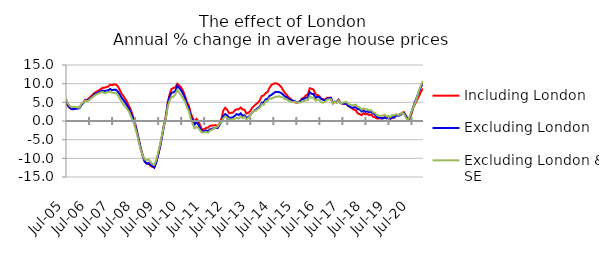
| Category | Including London | Excluding London | Excluding London & SE |
|---|---|---|---|
| 2005-07-01 | 5.042 | 5.34 | 6.041 |
| 2005-08-01 | 4.021 | 4.233 | 4.729 |
| 2005-09-01 | 3.44 | 3.609 | 4.031 |
| 2005-10-01 | 3.117 | 3.198 | 3.683 |
| 2005-11-01 | 3.119 | 3.179 | 3.804 |
| 2005-12-01 | 3.391 | 3.293 | 3.72 |
| 2006-01-01 | 3.46 | 3.314 | 3.632 |
| 2006-02-01 | 3.679 | 3.428 | 3.573 |
| 2006-03-01 | 4.36 | 4.288 | 4.578 |
| 2006-04-01 | 4.971 | 4.807 | 4.982 |
| 2006-05-01 | 5.703 | 5.549 | 5.472 |
| 2006-06-01 | 5.682 | 5.378 | 5.289 |
| 2006-07-01 | 6.13 | 5.818 | 5.553 |
| 2006-08-01 | 6.584 | 6.212 | 6.08 |
| 2006-09-01 | 7.141 | 6.725 | 6.422 |
| 2006-10-01 | 7.569 | 7.227 | 6.924 |
| 2006-11-01 | 7.9 | 7.477 | 7.14 |
| 2006-12-01 | 8.141 | 7.684 | 7.41 |
| 2007-01-01 | 8.527 | 7.906 | 7.62 |
| 2007-02-01 | 8.881 | 8.173 | 7.77 |
| 2007-03-01 | 8.911 | 8.019 | 7.457 |
| 2007-04-01 | 9.095 | 8.169 | 7.568 |
| 2007-05-01 | 9.213 | 8.204 | 7.716 |
| 2007-06-01 | 9.739 | 8.578 | 7.871 |
| 2007-07-01 | 9.603 | 8.264 | 7.598 |
| 2007-08-01 | 9.834 | 8.384 | 7.471 |
| 2007-09-01 | 9.759 | 8.353 | 7.476 |
| 2007-10-01 | 9.31 | 7.908 | 6.946 |
| 2007-11-01 | 8.338 | 7.116 | 6.089 |
| 2007-12-01 | 7.301 | 6.209 | 5.13 |
| 2008-01-01 | 6.594 | 5.569 | 4.358 |
| 2008-02-01 | 5.803 | 4.819 | 3.807 |
| 2008-03-01 | 4.897 | 4.031 | 3.135 |
| 2008-04-01 | 3.869 | 3.081 | 2.34 |
| 2008-05-01 | 2.669 | 1.982 | 1.042 |
| 2008-06-01 | 1.104 | 0.608 | -0.088 |
| 2008-07-01 | -0.68 | -0.992 | -1.674 |
| 2008-08-01 | -2.784 | -3 | -3.489 |
| 2008-09-01 | -5.142 | -5.294 | -5.824 |
| 2008-10-01 | -7.4 | -7.555 | -7.844 |
| 2008-11-01 | -9.283 | -9.376 | -9.246 |
| 2008-12-01 | -10.716 | -10.891 | -10.295 |
| 2009-01-01 | -11.416 | -11.431 | -10.399 |
| 2009-02-01 | -11.461 | -11.235 | -10.34 |
| 2009-03-01 | -11.986 | -11.748 | -10.864 |
| 2009-04-01 | -12.284 | -12.069 | -11.542 |
| 2009-05-01 | -12.391 | -12.497 | -11.751 |
| 2009-06-01 | -11.045 | -11.133 | -10.506 |
| 2009-07-01 | -9.035 | -9.204 | -8.454 |
| 2009-08-01 | -6.756 | -6.883 | -6.256 |
| 2009-09-01 | -3.959 | -4.358 | -3.813 |
| 2009-10-01 | -1.05 | -1.44 | -1.209 |
| 2009-11-01 | 1.332 | 0.762 | 0.706 |
| 2009-12-01 | 4.938 | 4.524 | 3.867 |
| 2010-01-01 | 7.185 | 6.538 | 5.474 |
| 2010-02-01 | 8.595 | 7.568 | 6.419 |
| 2010-03-01 | 8.825 | 7.698 | 6.489 |
| 2010-04-01 | 9.037 | 8.044 | 7.15 |
| 2010-05-01 | 9.954 | 9.479 | 8.277 |
| 2010-06-01 | 9.51 | 8.83 | 7.67 |
| 2010-07-01 | 8.98 | 8.233 | 6.814 |
| 2010-08-01 | 8.1 | 7.247 | 5.995 |
| 2010-09-01 | 6.68 | 6.17 | 5.224 |
| 2010-10-01 | 5.06 | 4.477 | 3.72 |
| 2010-11-01 | 4.111 | 3.455 | 2.686 |
| 2010-12-01 | 2.111 | 1.245 | 0.589 |
| 2011-01-01 | 0.812 | 0.009 | -0.813 |
| 2011-02-01 | -0.153 | -0.975 | -1.959 |
| 2011-03-01 | 0.561 | -0.352 | -1.604 |
| 2011-04-01 | -0.049 | -0.993 | -1.861 |
| 2011-05-01 | -1.337 | -2.104 | -2.603 |
| 2011-06-01 | -2.364 | -2.804 | -3.111 |
| 2011-07-01 | -2.193 | -2.71 | -3.015 |
| 2011-08-01 | -1.838 | -2.514 | -2.939 |
| 2011-09-01 | -1.815 | -2.702 | -3.127 |
| 2011-10-01 | -1.313 | -2.26 | -2.601 |
| 2011-11-01 | -1.193 | -2.051 | -2.33 |
| 2011-12-01 | -1.187 | -1.975 | -2.083 |
| 2012-01-01 | -1.1 | -1.808 | -1.74 |
| 2012-02-01 | -1.426 | -1.872 | -1.49 |
| 2012-03-01 | -0.66 | -1.074 | -0.763 |
| 2012-04-01 | 0.645 | -0.139 | -0.379 |
| 2012-05-01 | 2.851 | 1.385 | 0.785 |
| 2012-06-01 | 3.556 | 1.855 | 1.213 |
| 2012-07-01 | 2.98 | 1.48 | 0.842 |
| 2012-08-01 | 2.051 | 0.876 | 0.424 |
| 2012-09-01 | 2.183 | 0.85 | 0.325 |
| 2012-10-01 | 2.249 | 1.007 | 0.526 |
| 2012-11-01 | 2.896 | 1.405 | 0.672 |
| 2012-12-01 | 3.177 | 1.864 | 0.816 |
| 2013-01-01 | 3.149 | 1.614 | 0.648 |
| 2013-02-01 | 3.602 | 2.058 | 1.223 |
| 2013-03-01 | 3.097 | 1.383 | 0.768 |
| 2013-04-01 | 3.012 | 1.539 | 1.119 |
| 2013-05-01 | 1.998 | 0.817 | 0.37 |
| 2013-06-01 | 2.165 | 1.096 | 0.849 |
| 2013-07-01 | 2.664 | 1.622 | 1.488 |
| 2013-08-01 | 3.537 | 2.231 | 2.192 |
| 2013-09-01 | 4.062 | 2.809 | 2.824 |
| 2013-10-01 | 4.504 | 3.05 | 2.769 |
| 2013-11-01 | 4.904 | 3.489 | 3.256 |
| 2013-12-01 | 5.552 | 3.894 | 3.532 |
| 2014-01-01 | 6.672 | 4.881 | 4.507 |
| 2014-02-01 | 6.837 | 4.965 | 4.315 |
| 2014-03-01 | 7.485 | 5.784 | 5.271 |
| 2014-04-01 | 7.762 | 5.942 | 5.327 |
| 2014-05-01 | 8.89 | 6.699 | 6.153 |
| 2014-06-01 | 9.637 | 6.984 | 5.954 |
| 2014-07-01 | 9.951 | 7.361 | 6.199 |
| 2014-08-01 | 10.096 | 7.756 | 6.47 |
| 2014-09-01 | 10.007 | 7.805 | 6.464 |
| 2014-10-01 | 9.695 | 7.747 | 6.671 |
| 2014-11-01 | 9.213 | 7.531 | 6.418 |
| 2014-12-01 | 8.373 | 7.095 | 6.34 |
| 2015-01-01 | 7.547 | 6.647 | 5.856 |
| 2015-02-01 | 7.027 | 6.342 | 5.823 |
| 2015-03-01 | 6.305 | 5.908 | 5.404 |
| 2015-04-01 | 5.966 | 5.669 | 5.238 |
| 2015-05-01 | 5.412 | 5.482 | 5.073 |
| 2015-06-01 | 5.095 | 5.374 | 5.149 |
| 2015-07-01 | 4.873 | 5.112 | 5.019 |
| 2015-08-01 | 5.068 | 5.03 | 4.93 |
| 2015-09-01 | 5.314 | 5.251 | 4.922 |
| 2015-10-01 | 6.053 | 5.827 | 5.238 |
| 2015-11-01 | 6.264 | 5.939 | 5.358 |
| 2015-12-01 | 6.887 | 6.247 | 5.55 |
| 2016-01-01 | 7.107 | 6.314 | 5.615 |
| 2016-02-01 | 8.779 | 7.698 | 6.563 |
| 2016-03-01 | 8.635 | 7.291 | 6.253 |
| 2016-04-01 | 8.371 | 7.184 | 6.224 |
| 2016-05-01 | 7.156 | 6.181 | 5.489 |
| 2016-06-01 | 6.972 | 6.52 | 5.778 |
| 2016-07-01 | 6.659 | 6.355 | 5.535 |
| 2016-08-01 | 5.976 | 5.937 | 5.005 |
| 2016-09-01 | 5.835 | 5.644 | 4.902 |
| 2016-10-01 | 5.753 | 5.566 | 5.12 |
| 2016-11-01 | 6.201 | 5.946 | 5.677 |
| 2016-12-01 | 6.209 | 6.09 | 5.808 |
| 2017-01-01 | 6.212 | 6.218 | 5.846 |
| 2017-02-01 | 4.709 | 4.856 | 4.729 |
| 2017-03-01 | 5.087 | 5.218 | 5.135 |
| 2017-04-01 | 5.037 | 4.991 | 4.884 |
| 2017-05-01 | 5.713 | 5.63 | 5.481 |
| 2017-06-01 | 4.922 | 4.802 | 4.805 |
| 2017-07-01 | 4.694 | 4.681 | 4.875 |
| 2017-08-01 | 4.548 | 4.66 | 4.997 |
| 2017-09-01 | 4.546 | 4.661 | 5.149 |
| 2017-10-01 | 4.045 | 4.097 | 4.617 |
| 2017-11-01 | 3.801 | 3.778 | 4.397 |
| 2017-12-01 | 3.345 | 3.572 | 4.193 |
| 2018-01-01 | 3.076 | 3.616 | 4.283 |
| 2018-02-01 | 2.85 | 3.709 | 4.383 |
| 2018-03-01 | 2.045 | 3.175 | 3.754 |
| 2018-04-01 | 1.853 | 3.127 | 3.645 |
| 2018-05-01 | 1.563 | 2.563 | 3.05 |
| 2018-06-01 | 2.107 | 2.876 | 3.381 |
| 2018-07-01 | 1.779 | 2.45 | 3.027 |
| 2018-08-01 | 1.905 | 2.582 | 3.154 |
| 2018-09-01 | 1.567 | 2.333 | 2.802 |
| 2018-10-01 | 1.769 | 2.521 | 2.902 |
| 2018-11-01 | 1.108 | 2.039 | 2.339 |
| 2018-12-01 | 1.001 | 1.696 | 2.161 |
| 2019-01-01 | 0.646 | 1.113 | 1.586 |
| 2019-02-01 | 0.71 | 0.898 | 1.43 |
| 2019-03-01 | 0.702 | 0.774 | 1.356 |
| 2019-04-01 | 0.717 | 0.671 | 1.461 |
| 2019-05-01 | 1.014 | 0.946 | 1.719 |
| 2019-06-01 | 0.79 | 0.704 | 1.263 |
| 2019-07-01 | 0.928 | 0.941 | 1.389 |
| 2019-08-01 | 0.597 | 0.646 | 1.104 |
| 2019-09-01 | 0.881 | 0.975 | 1.585 |
| 2019-10-01 | 0.889 | 0.996 | 1.512 |
| 2019-11-01 | 1.516 | 1.479 | 1.827 |
| 2019-12-01 | 1.574 | 1.427 | 1.615 |
| 2020-01-01 | 1.812 | 1.519 | 1.719 |
| 2020-02-01 | 2.152 | 1.977 | 2.173 |
| 2020-03-01 | 2.381 | 2.124 | 1.958 |
| 2020-04-01 | 1.532 | 1.432 | 0.987 |
| 2020-05-01 | 0.486 | 0.558 | 0.254 |
| 2020-06-01 | 0.529 | 0.836 | 1.069 |
| 2020-07-01 | 1.943 | 2.31 | 2.525 |
| 2020-08-01 | 3.668 | 3.969 | 3.817 |
| 2020-09-01 | 4.624 | 5.315 | 4.933 |
| 2020-10-01 | 5.766 | 6.645 | 6.515 |
| 2020-11-01 | 6.742 | 8.059 | 8.353 |
| 2020-12-01 | 7.883 | 9.159 | 9.601 |
| 2021-01-01 | 8.685 | 10.11 | 10.728 |